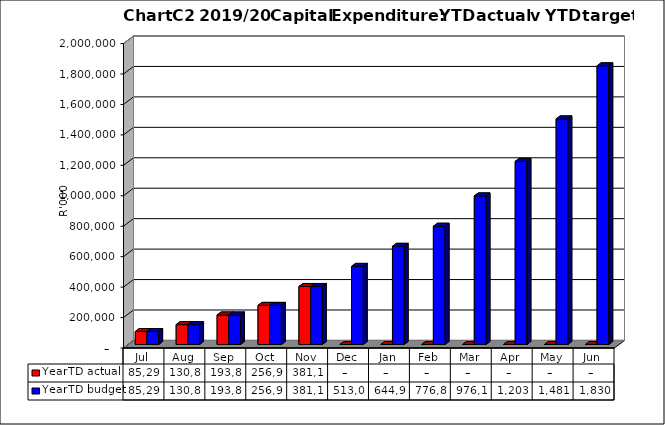
| Category | YearTD actual | YearTD budget |
|---|---|---|
| Jul | 85297669.12 | 85297669.12 |
| Aug | 130812960.887 | 130812960.887 |
| Sep | 193837445.496 | 193837445.496 |
| Oct | 256905748.808 | 256905748.808 |
| Nov | 381153474.478 | 381153474.478 |
| Dec | 0 | 513021474.478 |
| Jan | 0 | 644959474.478 |
| Feb | 0 | 776897474.478 |
| Mar | 0 | 976179474.478 |
| Apr | 0 | 1203170474.478 |
| May | 0 | 1481978474.478 |
| Jun | 0 | 1830632112 |